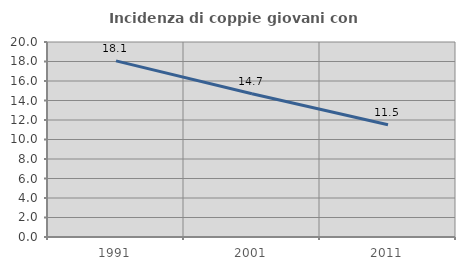
| Category | Incidenza di coppie giovani con figli |
|---|---|
| 1991.0 | 18.06 |
| 2001.0 | 14.695 |
| 2011.0 | 11.514 |